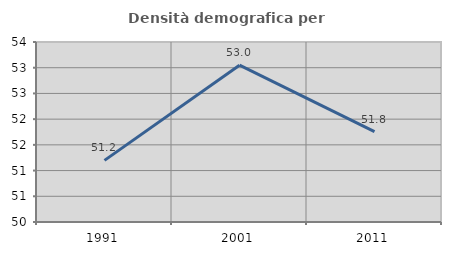
| Category | Densità demografica |
|---|---|
| 1991.0 | 51.199 |
| 2001.0 | 53.049 |
| 2011.0 | 51.758 |